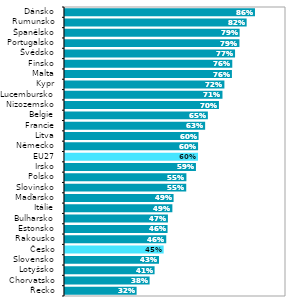
| Category | Series 1 |
|---|---|
| Řecko | 0.324 |
| Chorvatsko | 0.383 |
| Lotyšsko | 0.405 |
| Slovensko | 0.425 |
| Česko | 0.446 |
| Rakousko | 0.458 |
| Estonsko | 0.464 |
| Bulharsko | 0.466 |
| Itálie | 0.486 |
| Maďarsko | 0.491 |
| Slovinsko | 0.549 |
| Polsko | 0.549 |
| Irsko | 0.593 |
| EU27 | 0.602 |
| Německo | 0.602 |
| Litva | 0.604 |
| Francie | 0.634 |
| Belgie | 0.646 |
| Nizozemsko | 0.697 |
| Lucembursko | 0.713 |
| Kypr | 0.721 |
| Malta | 0.755 |
| Finsko | 0.757 |
| Švédsko | 0.77 |
| Portugalsko | 0.789 |
| Španělsko | 0.79 |
| Rumunsko | 0.822 |
| Dánsko | 0.86 |